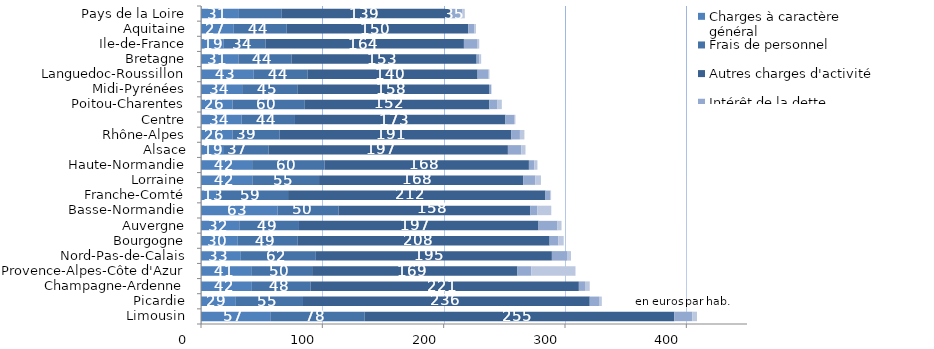
| Category | Charges à caractère général | Frais de personnel | Autres charges d'activité | Intérêt de la dette | Autres |
|---|---|---|---|---|---|
| Limousin | 57.122 | 77.789 | 255.145 | 14.801 | 3.931 |
| Picardie | 28.693 | 55.35 | 236.346 | 7.631 | 2.334 |
| Champagne-Ardenne | 41.883 | 48.417 | 221.125 | 5.045 | 3.926 |
| Provence-Alpes-Côte d'Azur | 41.424 | 50.18 | 169.19 | 11.495 | 36.369 |
| Nord-Pas-de-Calais | 32.797 | 61.829 | 194.572 | 12.458 | 3.273 |
| Bourgogne | 30.301 | 49.429 | 207.588 | 7.277 | 4.342 |
| Auvergne | 31.549 | 49.184 | 197.442 | 15.661 | 3.312 |
| Basse-Normandie | 63.097 | 50.179 | 158.219 | 5.577 | 11.616 |
| Franche-Comté | 12.613 | 59.151 | 212.156 | 3.994 | 0.613 |
| Lorraine | 42.319 | 54.986 | 168.197 | 10.031 | 4.651 |
| Haute-Normandie | 42.143 | 59.74 | 168.377 | 4.463 | 2.556 |
| Alsace | 18.95 | 36.802 | 197.186 | 11.068 | 3.428 |
| Rhône-Alpes | 25.891 | 38.965 | 190.982 | 7.01 | 3.701 |
| Centre | 33.501 | 43.938 | 173.46 | 7.072 | 1.172 |
| Poitou-Charentes | 25.933 | 59.62 | 152.114 | 6.747 | 3.529 |
| Midi-Pyrénées | 33.913 | 45.486 | 157.957 | 1.793 | 0.343 |
| Languedoc-Roussillon | 43.487 | 44.207 | 140.264 | 9.128 | 0.635 |
| Bretagne | 30.788 | 43.752 | 152.628 | 2.198 | 1.529 |
| Ile-de-France | 18.766 | 34.406 | 163.52 | 11.302 | 1.331 |
| Aquitaine | 27.003 | 43.636 | 149.602 | 5.155 | 1.187 |
| Pays de la Loire | 31.25 | 35.306 | 139.299 | 9.369 | 2.186 |